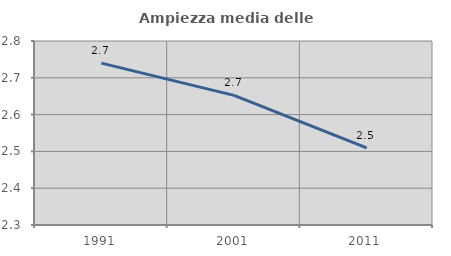
| Category | Ampiezza media delle famiglie |
|---|---|
| 1991.0 | 2.74 |
| 2001.0 | 2.652 |
| 2011.0 | 2.51 |